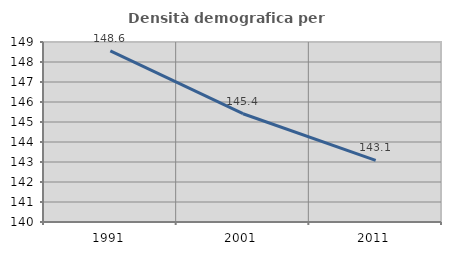
| Category | Densità demografica |
|---|---|
| 1991.0 | 148.559 |
| 2001.0 | 145.414 |
| 2011.0 | 143.082 |